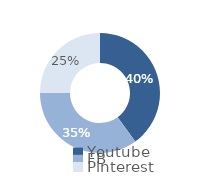
| Category | Series 0 |
|---|---|
| Youtube | 0.4 |
| FB | 0.35 |
| Pinterest | 0.25 |